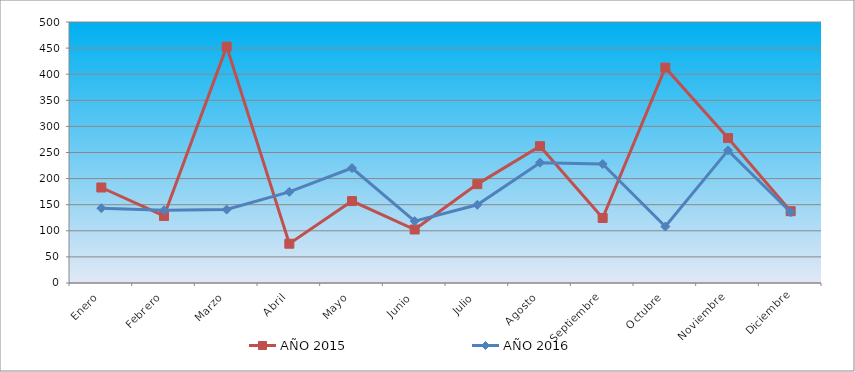
| Category | AÑO 2015 | AÑO 2016 |
|---|---|---|
| Enero | 182.939 | 143.288 |
| Febrero | 128.447 | 139.38 |
| Marzo | 452.807 | 140.682 |
| Abril | 75.252 | 174.55 |
| Mayo | 156.99 | 220.142 |
| Junio | 102.498 | 118.538 |
| Julio | 189.426 | 149.801 |
| Agosto | 262.083 | 230.563 |
| Septiembre | 124.554 | 227.957 |
| Octubre | 412.586 | 108.117 |
| Noviembre | 277.652 | 254.01 |
| Diciembre | 137.529 | 135.472 |